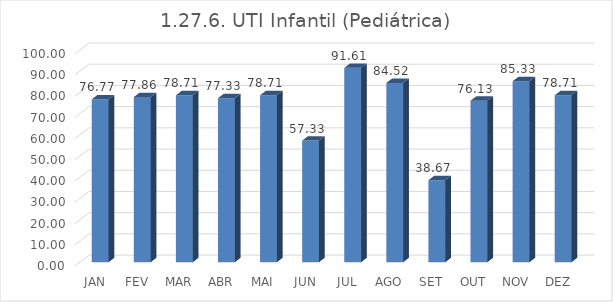
| Category | 1.27.6. UTI Infantil (Pediátrica) |
|---|---|
|  JAN  | 76.774 |
|  FEV  | 77.857 |
|  MAR  | 78.71 |
|  ABR  | 77.333 |
|  MAI  | 78.71 |
|  JUN  | 57.333 |
|  JUL  | 91.613 |
|  AGO  | 84.516 |
|  SET  | 38.667 |
|  OUT  | 76.129 |
|  NOV  | 85.333 |
|  DEZ  | 78.71 |